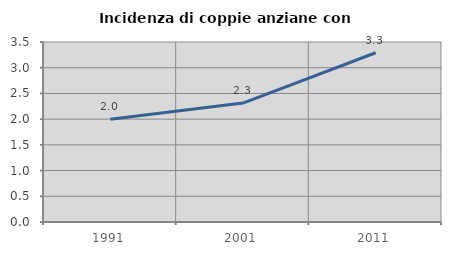
| Category | Incidenza di coppie anziane con figli |
|---|---|
| 1991.0 | 1.998 |
| 2001.0 | 2.313 |
| 2011.0 | 3.291 |